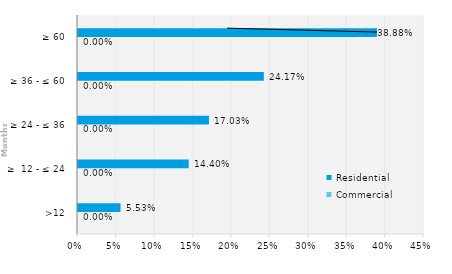
| Category | Commercial | Residential |
|---|---|---|
| >12 | 0 | 0.055 |
| ≥  12 - ≤ 24 | 0 | 0.144 |
| ≥ 24 - ≤ 36 | 0 | 0.17 |
| ≥ 36 - ≤ 60 | 0 | 0.242 |
| ≥ 60 | 0 | 0.389 |